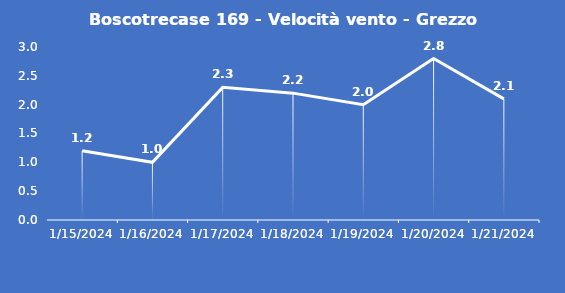
| Category | Boscotrecase 169 - Velocità vento - Grezzo (m/s) |
|---|---|
| 1/15/24 | 1.2 |
| 1/16/24 | 1 |
| 1/17/24 | 2.3 |
| 1/18/24 | 2.2 |
| 1/19/24 | 2 |
| 1/20/24 | 2.8 |
| 1/21/24 | 2.1 |